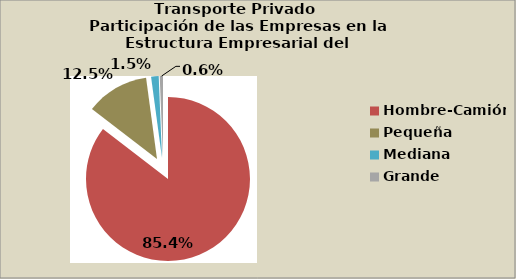
| Category | Series 0 |
|---|---|
| Hombre-Camión | 85.419 |
| Pequeña | 12.451 |
| Mediana | 1.487 |
| Grande | 0.643 |